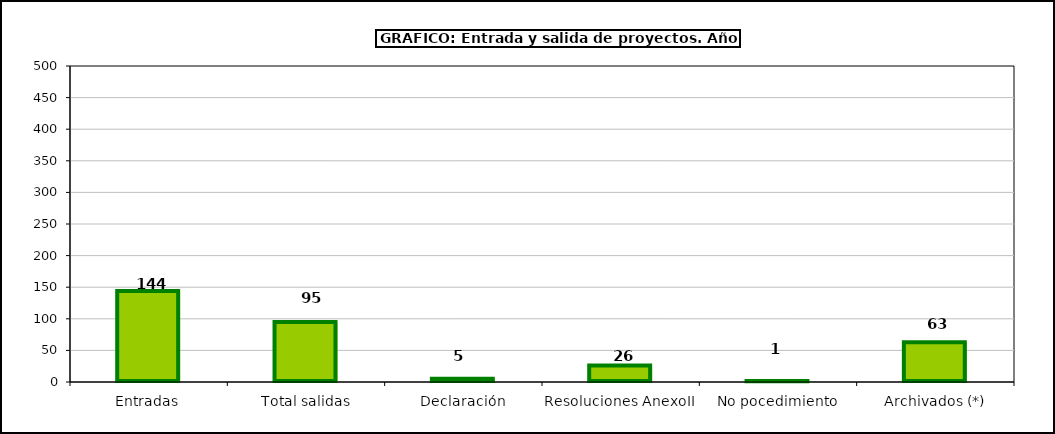
| Category | Total |
|---|---|
| 0 | 144 |
| 1 | 95 |
| 2 | 5 |
| 3 | 26 |
| 4 | 1 |
| 5 | 63 |